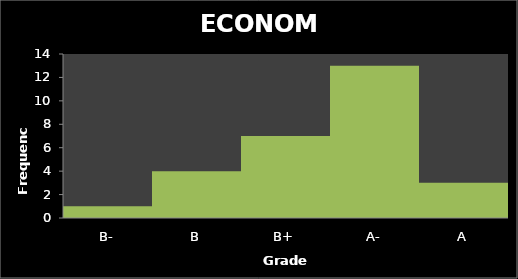
| Category | Series 0 |
|---|---|
| B- | 1 |
| B | 4 |
| B+ | 7 |
| A- | 13 |
| A | 3 |